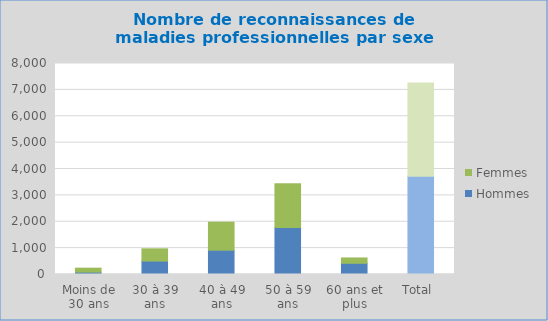
| Category | Hommes | Femmes |
|---|---|---|
| Moins de 30 ans | 90 | 150 |
| 30 à 39 ans | 509 | 464 |
| 40 à 49 ans | 922 | 1062 |
| 50 à 59 ans | 1782 | 1656 |
| 60 ans et plus | 425 | 202 |
| Total  | 3728 | 3534 |